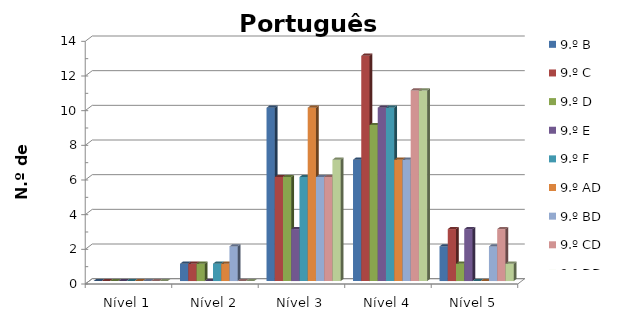
| Category | 9.º B | 9.º C | 9.º D | 9.º E | 9.º F | 9.º AD | 9.º BD | 9.º CD | 9.º DD |
|---|---|---|---|---|---|---|---|---|---|
| Nível 1 | 0 | 0 | 0 | 0 | 0 | 0 | 0 | 0 | 0 |
| Nível 2 | 1 | 1 | 1 | 0 | 1 | 1 | 2 | 0 | 0 |
| Nível 3 | 10 | 6 | 6 | 3 | 6 | 10 | 6 | 6 | 7 |
| Nível 4 | 7 | 13 | 9 | 10 | 10 | 7 | 7 | 11 | 11 |
| Nível 5 | 2 | 3 | 1 | 3 | 0 | 0 | 2 | 3 | 1 |